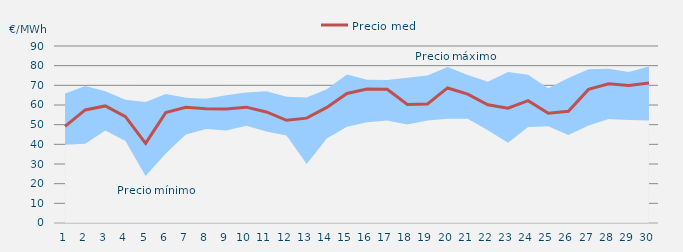
| Category | Precio medio |
|---|---|
| 1.0 | 49.137 |
| 2.0 | 57.477 |
| 3.0 | 59.535 |
| 4.0 | 54.115 |
| 5.0 | 40.493 |
| 6.0 | 56.146 |
| 7.0 | 58.841 |
| 8.0 | 58.051 |
| 9.0 | 57.98 |
| 10.0 | 58.899 |
| 11.0 | 56.47 |
| 12.0 | 52.2 |
| 13.0 | 53.314 |
| 14.0 | 58.798 |
| 15.0 | 65.856 |
| 16.0 | 68.091 |
| 17.0 | 67.954 |
| 18.0 | 60.256 |
| 19.0 | 60.524 |
| 20.0 | 68.673 |
| 21.0 | 65.556 |
| 22.0 | 60.116 |
| 23.0 | 58.335 |
| 24.0 | 62.196 |
| 25.0 | 55.8 |
| 26.0 | 56.801 |
| 27.0 | 67.941 |
| 28.0 | 70.753 |
| 29.0 | 69.933 |
| 30.0 | 71.17 |